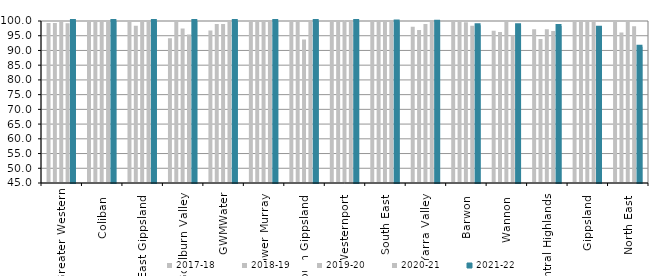
| Category | 2017-18 | 2018-19 | 2019-20 | 2020-21 | 2021-22 |
|---|---|---|---|---|---|
| Greater Western | 99.346 | 99.301 | 99.638 | 99.237 | 100 |
| Coliban  | 100 | 100 | 99.786 | 100 | 100 |
| East Gippsland  | 100 | 98.413 | 100 | 100 | 100 |
| Goulburn Valley  | 94.118 | 100 | 97.436 | 95.455 | 100 |
| GWMWater | 96.774 | 98.98 | 99.02 | 100 | 100 |
| Lower Murray  | 100 | 100 | 100 | 100 | 100 |
| South Gippsland  | 100 | 100 | 93.75 | 100 | 100 |
| Westernport  | 100 | 100 | 100 | 100 | 100 |
| South East  | 100 | 99.899 | 99.809 | 99.754 | 99.871 |
| Yarra Valley  | 98.082 | 96.962 | 98.973 | 99.81 | 99.71 |
| Barwon  | 99.681 | 100 | 99.573 | 98.423 | 98.558 |
| Wannon  | 96.703 | 96.296 | 100 | 95.161 | 98.529 |
| Central Highlands  | 97.222 | 93.902 | 97.17 | 96.575 | 98.333 |
| Gippsland  | 100 | 100 | 100 | 100 | 97.727 |
| North East  | 100 | 96.104 | 100 | 98.182 | 91.228 |